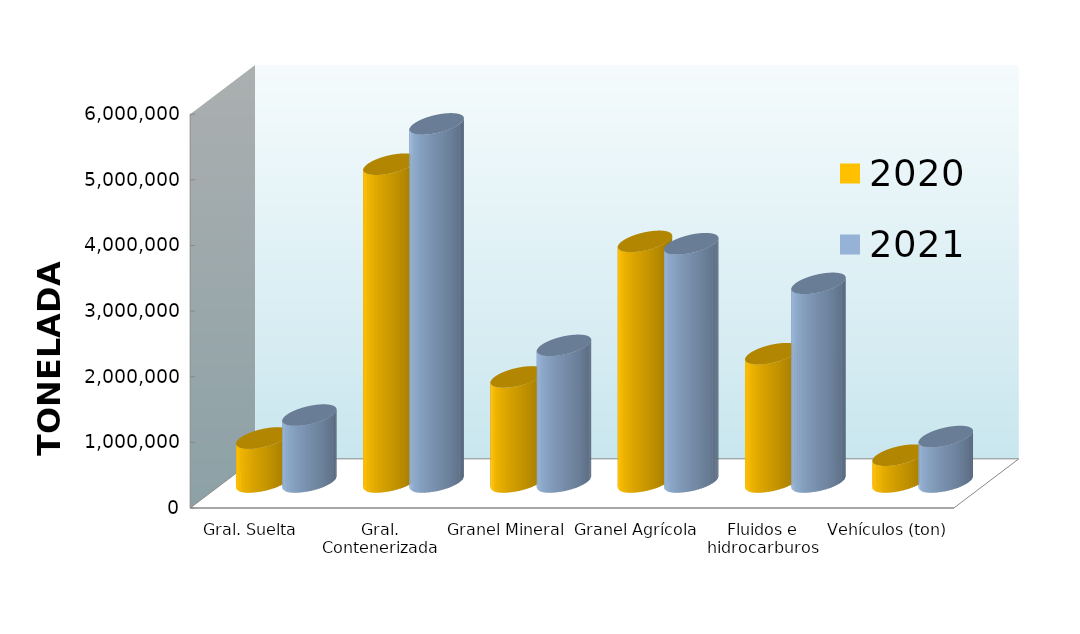
| Category | 2020 | 2021 |
|---|---|---|
| Gral. Suelta | 670471.168 | 1019521.905 |
| Gral. Contenerizada | 4841285.08 | 5455816.612 |
| Granel Mineral | 1601106.627 | 2081530.044 |
| Granel Agrícola | 3665916.314 | 3630091.818 |
| Fluidos e hidrocarburos | 1954724.768 | 3026201.539 |
| Vehículos (ton) | 407822.819 | 692690.615 |